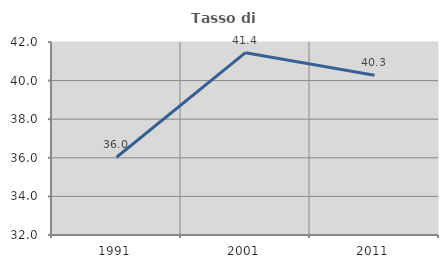
| Category | Tasso di occupazione   |
|---|---|
| 1991.0 | 36.029 |
| 2001.0 | 41.447 |
| 2011.0 | 40.274 |